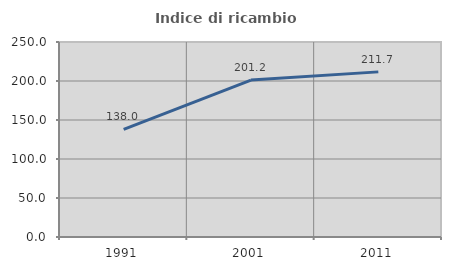
| Category | Indice di ricambio occupazionale  |
|---|---|
| 1991.0 | 137.963 |
| 2001.0 | 201.22 |
| 2011.0 | 211.702 |